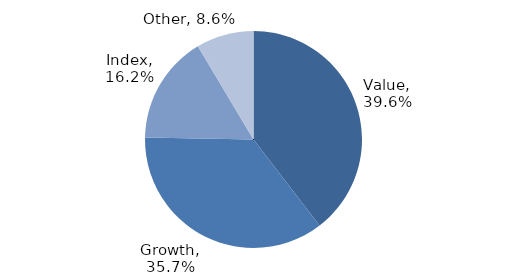
| Category | Investment Style |
|---|---|
| Value | 0.396 |
| Growth | 0.357 |
| Index | 0.162 |
| Other | 0.086 |